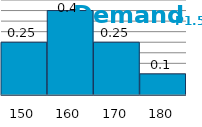
| Category | Series 1 |
|---|---|
| 150.0 | 0.25 |
| 160.0 | 0.4 |
| 170.0 | 0.25 |
| 180.0 | 0.1 |